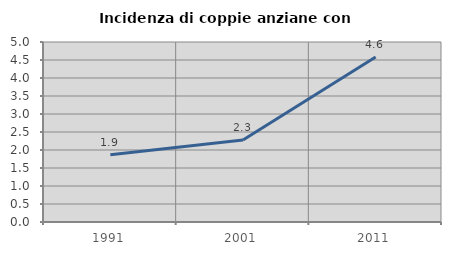
| Category | Incidenza di coppie anziane con figli |
|---|---|
| 1991.0 | 1.869 |
| 2001.0 | 2.279 |
| 2011.0 | 4.585 |